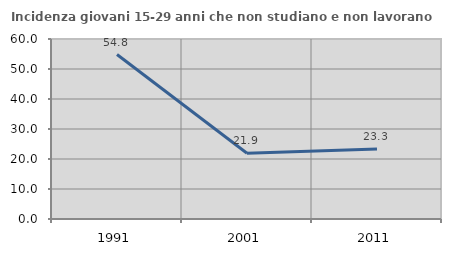
| Category | Incidenza giovani 15-29 anni che non studiano e non lavorano  |
|---|---|
| 1991.0 | 54.813 |
| 2001.0 | 21.935 |
| 2011.0 | 23.308 |